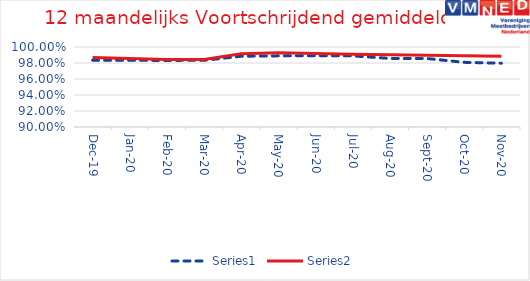
| Category | Series 0 | Series 1 |
|---|---|---|
| 2019-12-01 | 0.983 | 0.987 |
| 2020-01-01 | 0.983 | 0.986 |
| 2020-02-01 | 0.983 | 0.985 |
| 2020-03-01 | 0.983 | 0.984 |
| 2020-04-01 | 0.988 | 0.992 |
| 2020-05-01 | 0.989 | 0.993 |
| 2020-06-01 | 0.989 | 0.992 |
| 2020-07-01 | 0.989 | 0.991 |
| 2020-08-01 | 0.986 | 0.99 |
| 2020-09-01 | 0.986 | 0.99 |
| 2020-10-01 | 0.981 | 0.989 |
| 2020-11-01 | 0.98 | 0.989 |